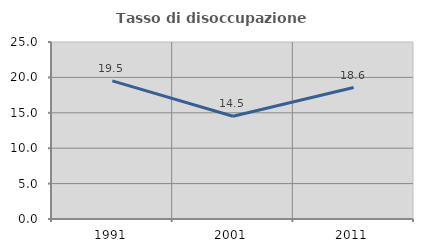
| Category | Tasso di disoccupazione giovanile  |
|---|---|
| 1991.0 | 19.512 |
| 2001.0 | 14.516 |
| 2011.0 | 18.571 |